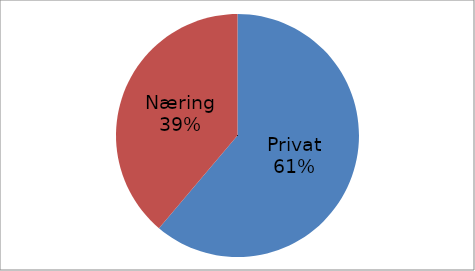
| Category | Series 0 |
|---|---|
| Privat | 50422277 |
| Næring | 31993937 |